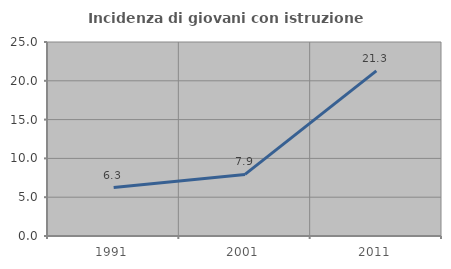
| Category | Incidenza di giovani con istruzione universitaria |
|---|---|
| 1991.0 | 6.25 |
| 2001.0 | 7.937 |
| 2011.0 | 21.277 |